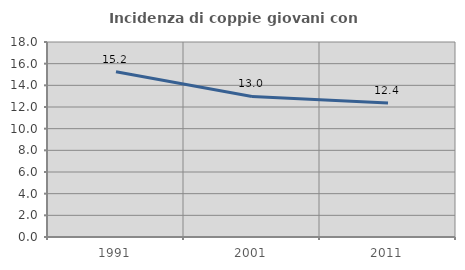
| Category | Incidenza di coppie giovani con figli |
|---|---|
| 1991.0 | 15.248 |
| 2001.0 | 12.975 |
| 2011.0 | 12.36 |